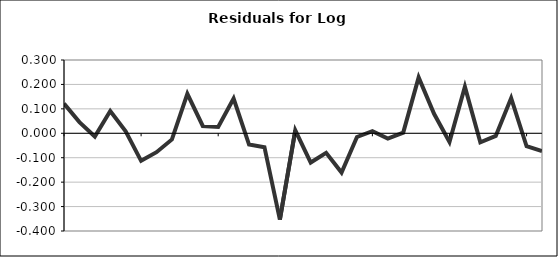
| Category | Series 0 |
|---|---|
| 0 | 0.122 |
| 1 | 0.046 |
| 2 | -0.013 |
| 3 | 0.091 |
| 4 | 0.008 |
| 5 | -0.113 |
| 6 | -0.077 |
| 7 | -0.025 |
| 8 | 0.162 |
| 9 | 0.03 |
| 10 | 0.026 |
| 11 | 0.142 |
| 12 | -0.046 |
| 13 | -0.057 |
| 14 | -0.353 |
| 15 | 0.012 |
| 16 | -0.12 |
| 17 | -0.08 |
| 18 | -0.161 |
| 19 | -0.015 |
| 20 | 0.008 |
| 21 | -0.022 |
| 22 | 0.003 |
| 23 | 0.229 |
| 24 | 0.08 |
| 25 | -0.036 |
| 26 | 0.191 |
| 27 | -0.037 |
| 28 | -0.011 |
| 29 | 0.144 |
| 30 | -0.053 |
| 31 | -0.073 |